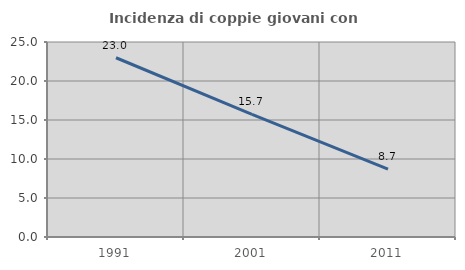
| Category | Incidenza di coppie giovani con figli |
|---|---|
| 1991.0 | 22.981 |
| 2001.0 | 15.732 |
| 2011.0 | 8.715 |